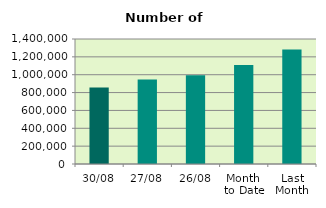
| Category | Series 0 |
|---|---|
| 30/08 | 857272 |
| 27/08 | 947570 |
| 26/08 | 994346 |
| Month 
to Date | 1108994.857 |
| Last
Month | 1281605.545 |